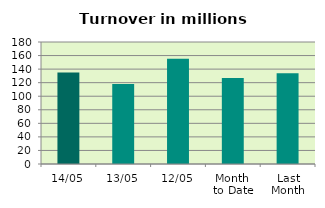
| Category | Series 0 |
|---|---|
| 14/05 | 135.03 |
| 13/05 | 118.068 |
| 12/05 | 155.278 |
| Month 
to Date | 127.037 |
| Last
Month | 133.981 |